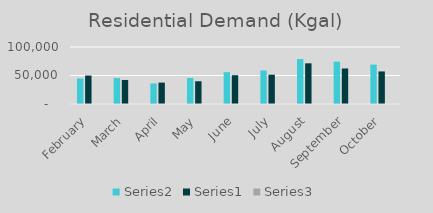
| Category | Series 1 | Series 0 | Series 2 |
|---|---|---|---|
| February | 44769 | 49996 | 0.895 |
| March | 45502 | 42168 | 1.079 |
| April | 36081 | 37537 | 0.961 |
| May | 45570 | 39883 | 1.143 |
| June | 55783 | 50498 | 1.105 |
| July | 58740 | 51383 | 1.143 |
| August | 78887 | 71400 | 1.105 |
| September | 74265 | 62313 | 1.192 |
| October | 69149 | 57107 | 1.211 |